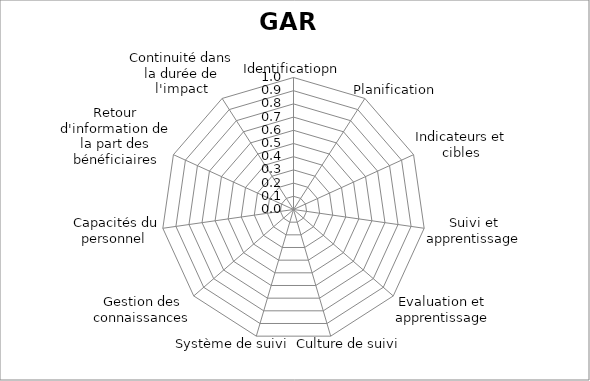
| Category | Identificatiopn Planification Indicateurs et cibles Suivi et apprentissage Evaluation et apprentissage Culture de suivi Système de suivi Gestion des connaissances Capacités du personnel  Retour d'information de la part des bénéficiaires Continuité dans la |
|---|---|
| Identificatiopn | 0 |
| Planification | 0 |
| Indicateurs et cibles | 0 |
| Suivi et apprentissage | 0 |
| Evaluation et apprentissage | 0 |
| Culture de suivi | 0 |
| Système de suivi | 0 |
| Gestion des connaissances | 0 |
| Capacités du personnel  | 0 |
| Retour d'information de la part des bénéficiaires | 0 |
| Continuité dans la durée de l'impact | 0 |